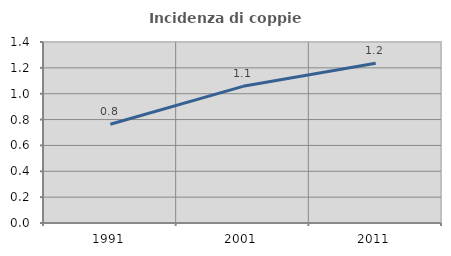
| Category | Incidenza di coppie miste |
|---|---|
| 1991.0 | 0.763 |
| 2001.0 | 1.057 |
| 2011.0 | 1.236 |